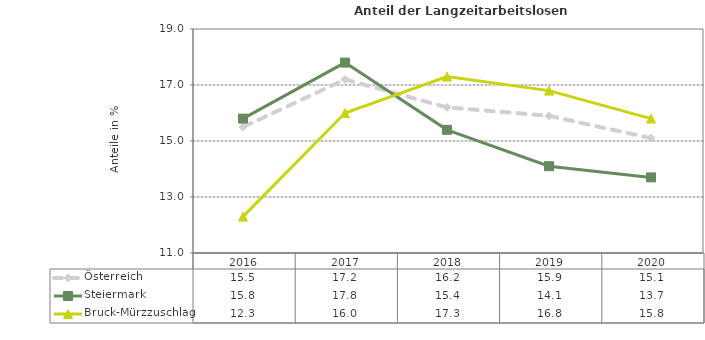
| Category | Österreich | Steiermark | Bruck-Mürzzuschlag |
|---|---|---|---|
| 2020.0 | 15.1 | 13.7 | 15.8 |
| 2019.0 | 15.9 | 14.1 | 16.8 |
| 2018.0 | 16.2 | 15.4 | 17.3 |
| 2017.0 | 17.2 | 17.8 | 16 |
| 2016.0 | 15.5 | 15.8 | 12.3 |